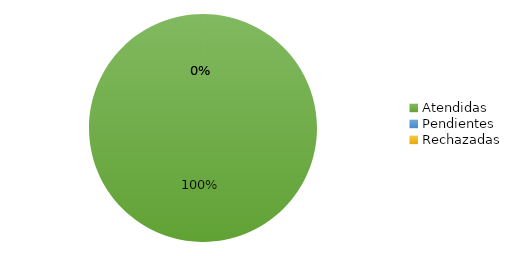
| Category | 4 |
|---|---|
| Atendidas | 4 |
| Pendientes  | 0 |
| Rechazadas | 0 |